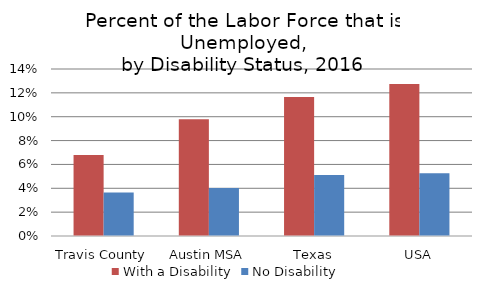
| Category | With a Disability | No Disability |
|---|---|---|
| Travis County | 0.068 | 0.037 |
| Austin MSA | 0.098 | 0.04 |
| Texas | 0.117 | 0.051 |
| USA | 0.127 | 0.053 |